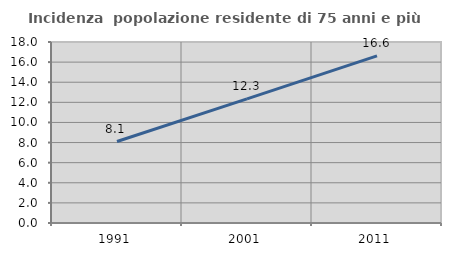
| Category | Incidenza  popolazione residente di 75 anni e più |
|---|---|
| 1991.0 | 8.105 |
| 2001.0 | 12.34 |
| 2011.0 | 16.624 |